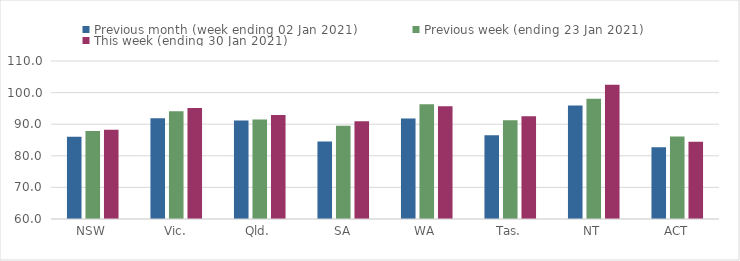
| Category | Previous month (week ending 02 Jan 2021) | Previous week (ending 23 Jan 2021) | This week (ending 30 Jan 2021) |
|---|---|---|---|
| NSW | 86.02 | 87.86 | 88.27 |
| Vic. | 91.89 | 94.11 | 95.13 |
| Qld. | 91.2 | 91.45 | 92.88 |
| SA | 84.52 | 89.5 | 90.91 |
| WA | 91.84 | 96.34 | 95.65 |
| Tas. | 86.49 | 91.22 | 92.48 |
| NT | 95.91 | 98.06 | 102.52 |
| ACT | 82.72 | 86.09 | 84.41 |